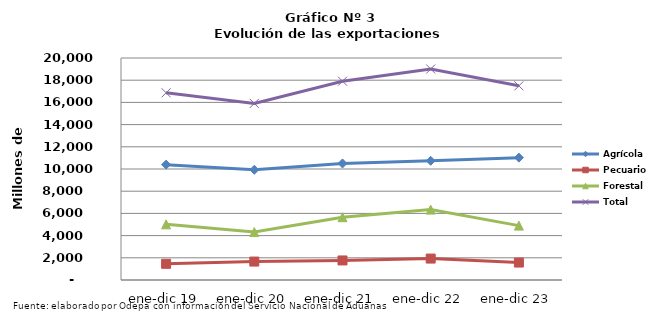
| Category | Agrícola | Pecuario | Forestal | Total |
|---|---|---|---|---|
| ene-dic 19 | 10391776 | 1458553 | 5015413 | 16865742 |
| ene-dic 20 | 9929878 | 1660483 | 4319256 | 15909617 |
| ene-dic 21 | 10496669 | 1759600 | 5655304 | 17911573 |
| ene-dic 22 | 10737643 | 1931031 | 6341200 | 19009874 |
| ene-dic 23 | 11022613 | 1571491 | 4898677 | 17492781 |